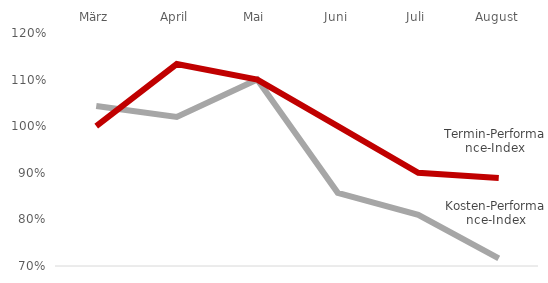
| Category | Kosten-Performance-Index | Termin-Performance-Index |
|---|---|---|
| März | 1.043 | 1 |
| April | 1.02 | 1.133 |
| Mai | 1.1 | 1.1 |
| Juni | 0.857 | 1 |
| Juli | 0.81 | 0.9 |
| August | 0.716 | 0.889 |